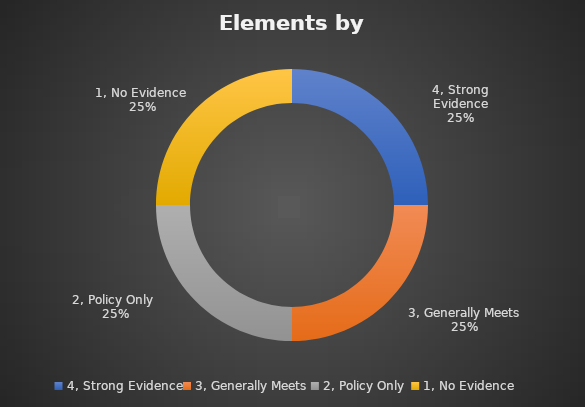
| Category | Series 1 |
|---|---|
| 4, Strong Evidence | 0.004 |
| 3, Generally Meets | 0.004 |
| 2, Policy Only  | 0.004 |
| 1, No Evidence  | 0.004 |